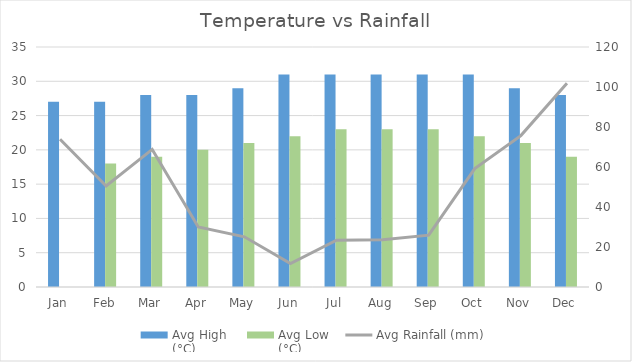
| Category | Avg High 
(°C) | Avg Low
(°C) |
|---|---|---|
| Jan | 27 | 0 |
| Feb | 27 | 18 |
| Mar | 28 | 19 |
| Apr | 28 | 20 |
| May | 29 | 21 |
| Jun | 31 | 22 |
| Jul | 31 | 23 |
| Aug | 31 | 23 |
| Sep | 31 | 23 |
| Oct | 31 | 22 |
| Nov | 29 | 21 |
| Dec | 28 | 19 |